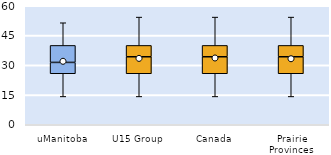
| Category | 25th | 50th | 75th |
|---|---|---|---|
| uManitoba | 25.714 | 5.714 | 8.571 |
| U15 Group | 25.714 | 8.571 | 5.714 |
| Canada | 25.714 | 8.571 | 5.714 |
| Prairie Provinces | 25.714 | 8.571 | 5.714 |